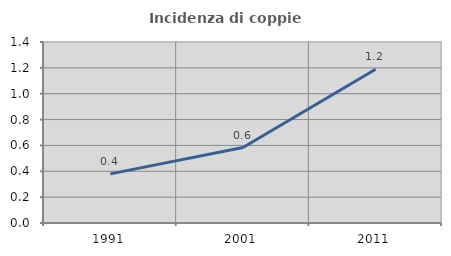
| Category | Incidenza di coppie miste |
|---|---|
| 1991.0 | 0.38 |
| 2001.0 | 0.584 |
| 2011.0 | 1.189 |